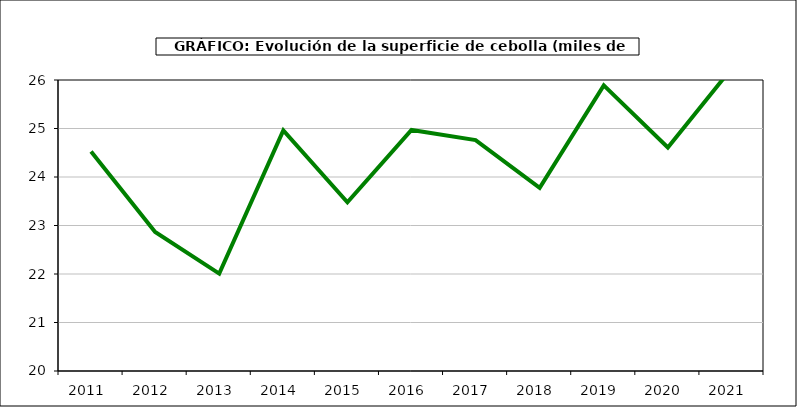
| Category | superficie |
|---|---|
| 2011.0 | 24.526 |
| 2012.0 | 22.867 |
| 2013.0 | 22.008 |
| 2014.0 | 24.961 |
| 2015.0 | 23.48 |
| 2016.0 | 24.969 |
| 2017.0 | 24.762 |
| 2018.0 | 23.775 |
| 2019.0 | 25.889 |
| 2020.0 | 24.608 |
| 2021.0 | 26.248 |